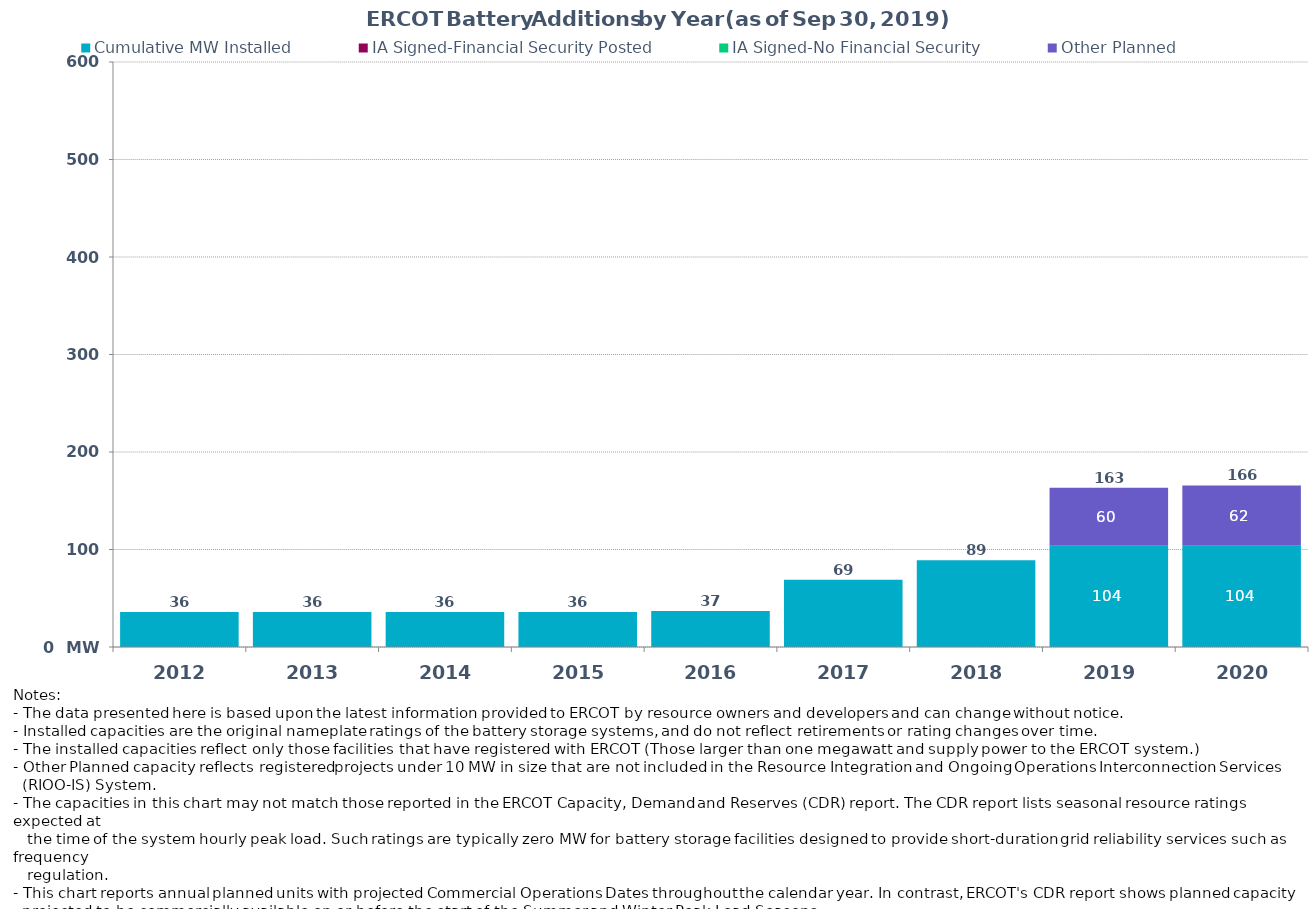
| Category | Cumulative MW Installed | IA Signed-Financial Security Posted  | IA Signed-No Financial Security  | Other Planned | Cumulative Installed and Planned |
|---|---|---|---|---|---|
| 2012.0 | 36 | 0 | 0 | 0 | 36 |
| 2013.0 | 36 | 0 | 0 | 0 | 36 |
| 2014.0 | 36 | 0 | 0 | 0 | 36 |
| 2015.0 | 36 | 0 | 0 | 0 | 36 |
| 2016.0 | 37 | 0 | 0 | 0 | 37 |
| 2017.0 | 69 | 0 | 0 | 0 | 69 |
| 2018.0 | 89 | 0 | 0 | 0 | 89 |
| 2019.0 | 103.9 | 0 | 0 | 59.5 | 163.4 |
| 2020.0 | 103.9 | 0 | 0 | 61.75 | 165.65 |